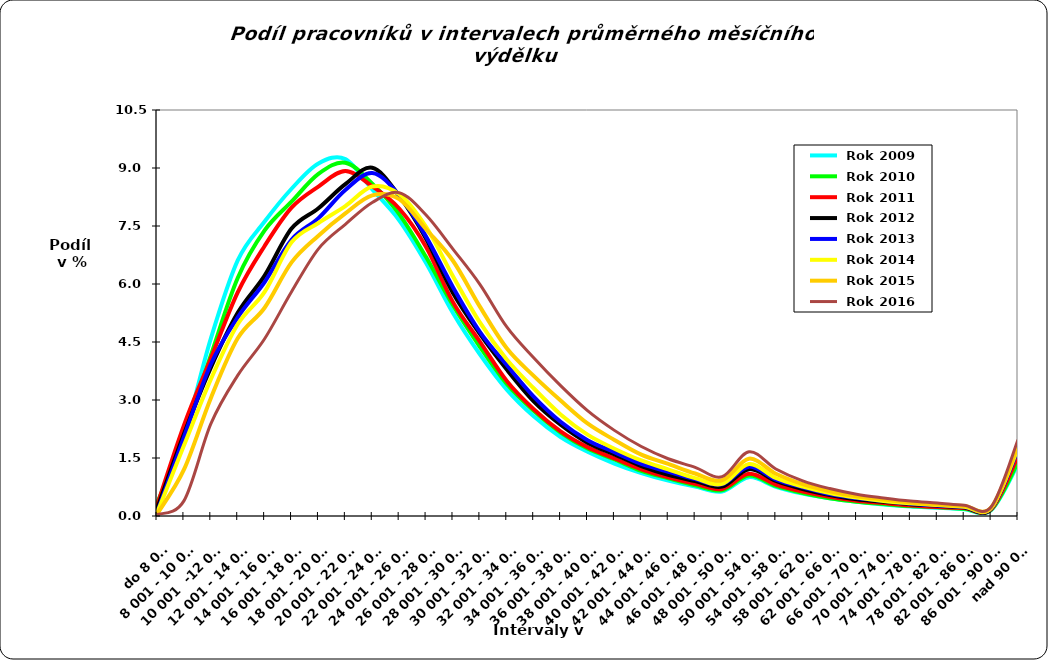
| Category |  Rok 2009 |  Rok 2010 |  Rok 2011 |  Rok 2012 |  Rok 2013 |  Rok 2014 |  Rok 2015 |  Rok 2016 |
|---|---|---|---|---|---|---|---|---|
| do 8 000 | 0.312 | 0.318 | 0.272 | 0.181 | 0.079 | 0.071 | 0.048 | 0.035 |
| 8 001 - 10 000 | 2.062 | 2.061 | 2.344 | 2.115 | 2.04 | 1.823 | 1.198 | 0.391 |
| 10 001  -12 000 | 4.589 | 4.154 | 4.072 | 3.836 | 3.924 | 3.533 | 3.047 | 2.382 |
| 12 001 - 14 000 | 6.611 | 6.153 | 5.786 | 5.254 | 5.136 | 4.959 | 4.595 | 3.637 |
| 14 001 - 16 000 | 7.615 | 7.385 | 6.984 | 6.215 | 6.051 | 5.795 | 5.386 | 4.584 |
| 16 001 - 18 000 | 8.463 | 8.129 | 7.974 | 7.433 | 7.145 | 7.078 | 6.558 | 5.799 |
| 18 001 - 20 000 | 9.117 | 8.848 | 8.521 | 7.96 | 7.704 | 7.578 | 7.25 | 6.909 |
| 20 001 - 22 000 | 9.23 | 9.136 | 8.92 | 8.581 | 8.431 | 8.013 | 7.825 | 7.543 |
| 22 001 - 24 000 | 8.445 | 8.597 | 8.526 | 9.007 | 8.87 | 8.52 | 8.291 | 8.107 |
| 24 001 - 26 000 | 7.65 | 7.808 | 7.953 | 8.279 | 8.298 | 8.323 | 8.194 | 8.36 |
| 26 001 - 28 000 | 6.542 | 6.696 | 6.96 | 7.17 | 7.225 | 7.476 | 7.417 | 7.784 |
| 28 001 - 30 000 | 5.251 | 5.448 | 5.531 | 5.765 | 5.918 | 6.2 | 6.601 | 6.904 |
| 30 001 - 32 000 | 4.183 | 4.377 | 4.511 | 4.708 | 4.764 | 5.006 | 5.415 | 5.992 |
| 32 001 - 34 000 | 3.27 | 3.413 | 3.49 | 3.786 | 3.903 | 4.046 | 4.337 | 4.89 |
| 34 001 - 36 000 | 2.579 | 2.72 | 2.76 | 2.966 | 3.088 | 3.304 | 3.624 | 4.091 |
| 36 001 - 38 000 | 2.044 | 2.159 | 2.189 | 2.361 | 2.437 | 2.627 | 2.986 | 3.371 |
| 38 001 - 40 000 | 1.664 | 1.744 | 1.78 | 1.895 | 1.961 | 2.105 | 2.394 | 2.724 |
| 40 001 - 42 000 | 1.357 | 1.462 | 1.488 | 1.59 | 1.652 | 1.741 | 1.967 | 2.214 |
| 42 001 - 44 000 | 1.11 | 1.165 | 1.205 | 1.292 | 1.346 | 1.436 | 1.587 | 1.796 |
| 44 001 - 46 000 | 0.914 | 0.974 | 1.001 | 1.064 | 1.145 | 1.206 | 1.347 | 1.48 |
| 46 001 - 48 000 | 0.763 | 0.796 | 0.831 | 0.906 | 0.953 | 0.981 | 1.099 | 1.258 |
| 48 001 - 50 000 | 0.636 | 0.665 | 0.7 | 0.759 | 0.818 | 0.83 | 0.924 | 1.017 |
| 50 001 - 54 000 | 1.005 | 1.048 | 1.094 | 1.211 | 1.276 | 1.343 | 1.483 | 1.661 |
| 54 001 - 58 000 | 0.756 | 0.778 | 0.814 | 0.906 | 0.943 | 0.982 | 1.092 | 1.216 |
| 58 001 - 62 000 | 0.58 | 0.595 | 0.635 | 0.696 | 0.744 | 0.76 | 0.823 | 0.908 |
| 62 001 - 66 000 | 0.456 | 0.46 | 0.497 | 0.544 | 0.565 | 0.594 | 0.639 | 0.71 |
| 66 001 - 70 000 | 0.366 | 0.371 | 0.396 | 0.432 | 0.463 | 0.475 | 0.508 | 0.563 |
| 70 001 - 74 000 | 0.296 | 0.312 | 0.333 | 0.37 | 0.389 | 0.388 | 0.427 | 0.467 |
| 74 001 - 78 000 | 0.248 | 0.255 | 0.274 | 0.306 | 0.319 | 0.33 | 0.351 | 0.387 |
| 78 001 - 82 000 | 0.214 | 0.225 | 0.234 | 0.266 | 0.275 | 0.282 | 0.295 | 0.335 |
| 82 001 - 86 000 | 0.176 | 0.188 | 0.204 | 0.218 | 0.233 | 0.239 | 0.259 | 0.277 |
| 86 001 - 90 000 | 0.151 | 0.159 | 0.171 | 0.187 | 0.197 | 0.202 | 0.217 | 0.235 |
| nad 90 001 | 1.346 | 1.397 | 1.551 | 1.738 | 1.71 | 1.756 | 1.818 | 1.973 |